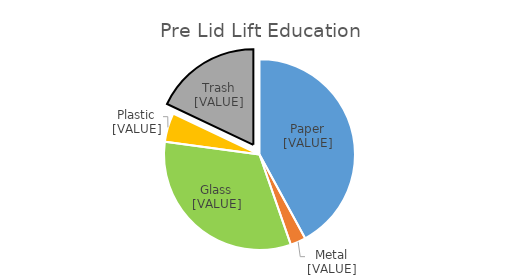
| Category | Series 0 |
|---|---|
| Paper | 0.421 |
| Metals | 0.026 |
| Glass | 0.325 |
| Plastic | 0.049 |
| Trash  | 0.18 |